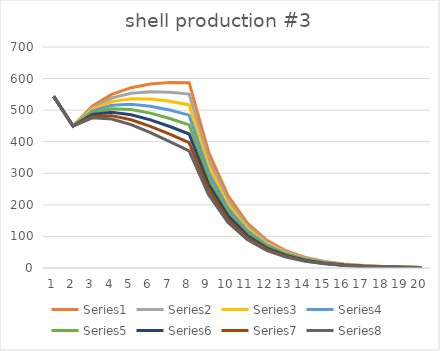
| Category | Series 1 | Series 2 | Series 3 | Series 4 | Series 5 | Series 6 | Series 7 | Series 8 |
|---|---|---|---|---|---|---|---|---|
| 0 | 543.684 | 543.684 | 543.684 | 543.684 | 543.684 | 543.684 | 543.684 | 543.684 |
| 1 | 449.739 | 449.739 | 449.739 | 449.739 | 449.739 | 449.739 | 449.739 | 449.739 |
| 2 | 513.395 | 507.99 | 502.586 | 497.182 | 491.778 | 486.374 | 480.97 | 475.566 |
| 3 | 549.845 | 538.331 | 526.938 | 515.667 | 504.517 | 493.49 | 482.585 | 471.801 |
| 4 | 571.138 | 553.292 | 535.821 | 518.721 | 501.99 | 485.622 | 469.613 | 453.961 |
| 5 | 582.624 | 558.477 | 535.089 | 512.443 | 490.523 | 469.314 | 448.801 | 428.968 |
| 6 | 587.27 | 557.005 | 528 | 500.217 | 473.616 | 448.159 | 423.808 | 400.528 |
| 7 | 586.934 | 550.826 | 516.589 | 484.144 | 453.415 | 424.329 | 396.814 | 370.803 |
| 8 | 368.131 | 345.484 | 324.01 | 303.66 | 284.386 | 266.143 | 248.886 | 232.571 |
| 9 | 229.756 | 215.622 | 202.219 | 189.519 | 177.49 | 166.104 | 155.334 | 145.151 |
| 10 | 142.829 | 134.042 | 125.71 | 117.815 | 110.337 | 103.259 | 96.564 | 90.234 |
| 11 | 88.504 | 83.059 | 77.896 | 73.004 | 68.37 | 63.984 | 59.836 | 55.913 |
| 12 | 54.694 | 51.329 | 48.139 | 45.115 | 42.252 | 39.541 | 36.977 | 34.554 |
| 13 | 33.723 | 31.648 | 29.681 | 27.817 | 26.052 | 24.38 | 22.799 | 21.305 |
| 14 | 20.752 | 19.476 | 18.265 | 17.118 | 16.032 | 15.003 | 14.03 | 13.111 |
| 15 | 12.749 | 11.965 | 11.221 | 10.516 | 9.849 | 9.217 | 8.619 | 8.054 |
| 16 | 7.821 | 7.34 | 6.883 | 6.451 | 6.042 | 5.654 | 5.287 | 4.941 |
| 17 | 4.791 | 4.496 | 4.217 | 3.952 | 3.701 | 3.464 | 3.239 | 3.027 |
| 18 | 2.932 | 2.751 | 2.58 | 2.418 | 2.265 | 2.12 | 1.982 | 1.852 |
| 19 | 1.792 | 1.682 | 1.577 | 1.478 | 1.385 | 1.296 | 1.212 | 1.132 |